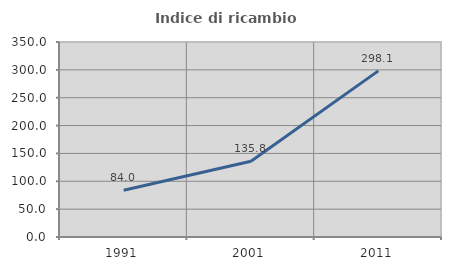
| Category | Indice di ricambio occupazionale  |
|---|---|
| 1991.0 | 84.034 |
| 2001.0 | 135.817 |
| 2011.0 | 298.131 |